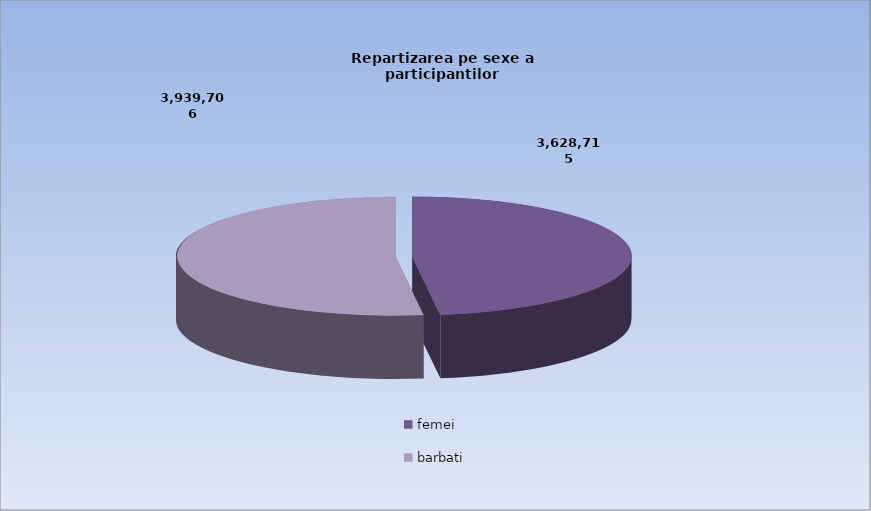
| Category | Series 0 |
|---|---|
| femei | 3628715 |
| barbati | 3939706 |